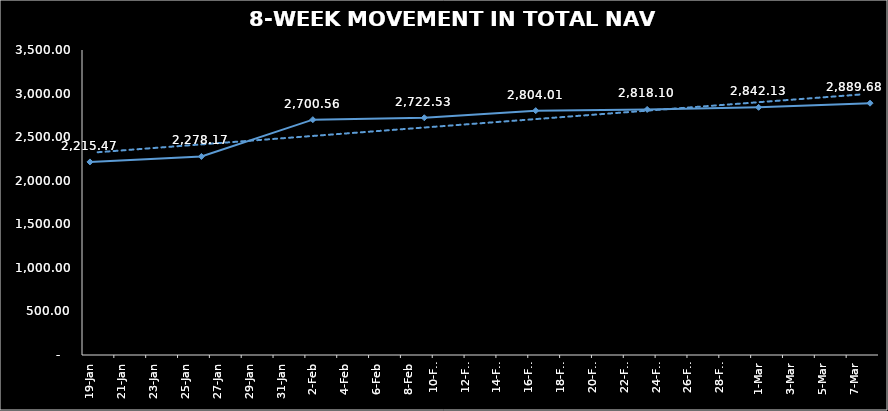
| Category | TOTAL NAV |
|---|---|
| 2024-01-19 | 2215.471 |
| 2024-01-26 | 2278.172 |
| 2024-02-02 | 2700.559 |
| 2024-02-09 | 2722.532 |
| 2024-02-16 | 2804.014 |
| 2024-02-23 | 2818.099 |
| 2024-03-01 | 2842.127 |
| 2024-03-08 | 2889.675 |